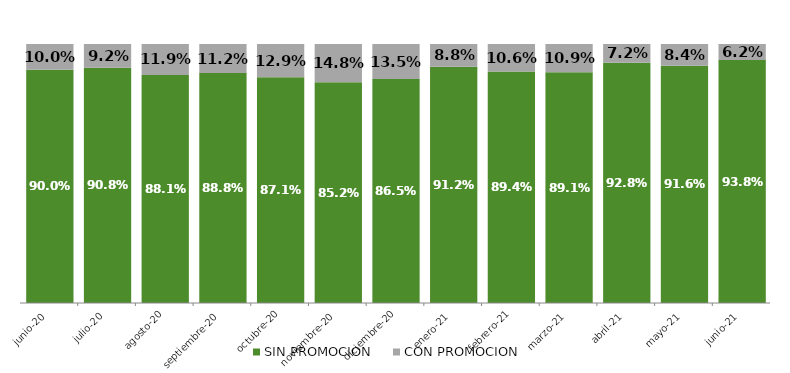
| Category | SIN PROMOCION   | CON PROMOCION   |
|---|---|---|
| 2020-06-01 | 0.9 | 0.1 |
| 2020-07-01 | 0.908 | 0.092 |
| 2020-08-01 | 0.881 | 0.119 |
| 2020-09-01 | 0.888 | 0.112 |
| 2020-10-01 | 0.871 | 0.129 |
| 2020-11-01 | 0.852 | 0.148 |
| 2020-12-01 | 0.865 | 0.135 |
| 2021-01-01 | 0.912 | 0.088 |
| 2021-02-01 | 0.894 | 0.106 |
| 2021-03-01 | 0.891 | 0.109 |
| 2021-04-01 | 0.928 | 0.072 |
| 2021-05-01 | 0.916 | 0.084 |
| 2021-06-01 | 0.938 | 0.062 |